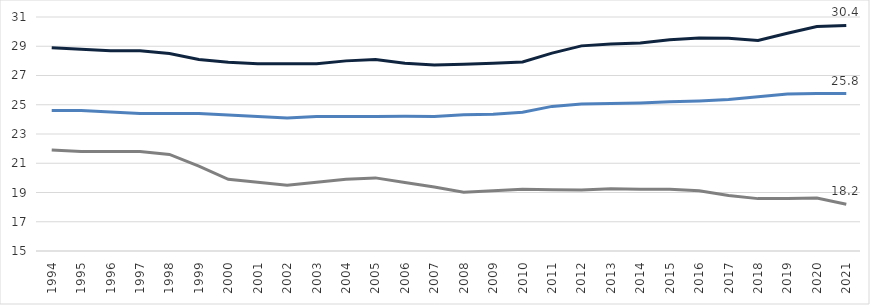
| Category | Formation en collège (1) | Formation pro en lycée | Formation GT en lycée |
|---|---|---|---|
| 1994 | 24.6 | 21.9 | 28.9 |
| 1995 | 24.6 | 21.8 | 28.8 |
| 1996 | 24.5 | 21.8 | 28.7 |
| 1997 | 24.4 | 21.8 | 28.7 |
| 1998 | 24.4 | 21.6 | 28.5 |
| 1999 | 24.4 | 20.8 | 28.1 |
| 2000 | 24.3 | 19.9 | 27.9 |
| 2001 | 24.2 | 19.7 | 27.8 |
| 2002 | 24.1 | 19.5 | 27.8 |
| 2003 | 24.2 | 19.7 | 27.8 |
| 2004 | 24.2 | 19.9 | 28 |
| 2005 | 24.201 | 19.999 | 28.096 |
| 2006 | 24.212 | 19.684 | 27.834 |
| 2007 | 24.195 | 19.381 | 27.711 |
| 2008 | 24.32 | 19.025 | 27.776 |
| 2009 | 24.357 | 19.112 | 27.837 |
| 2010 | 24.487 | 19.228 | 27.926 |
| 2011 | 24.888 | 19.188 | 28.53 |
| 2012 | 25.056 | 19.163 | 29.026 |
| 2013 | 25.082 | 19.262 | 29.151 |
| 2014 | 25.119 | 19.223 | 29.228 |
| 2015 | 25.2 | 19.215 | 29.446 |
| 2016 | 25.264 | 19.117 | 29.568 |
| 2017 | 25.361 | 18.79 | 29.553 |
| 2018 | 25.544 | 18.581 | 29.395 |
| 2019 | 25.727 | 18.585 | 29.892 |
| 2020 | 25.766 | 18.624 | 30.345 |
| 2021 | 25.764 | 18.195 | 30.424 |